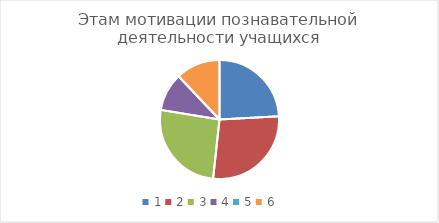
| Category | Series 0 |
|---|---|
| 0 | 0.275 |
| 1 | 0.314 |
| 2 | 0.294 |
| 3 | 0.118 |
| 4 | 0 |
| 5 | 0.137 |